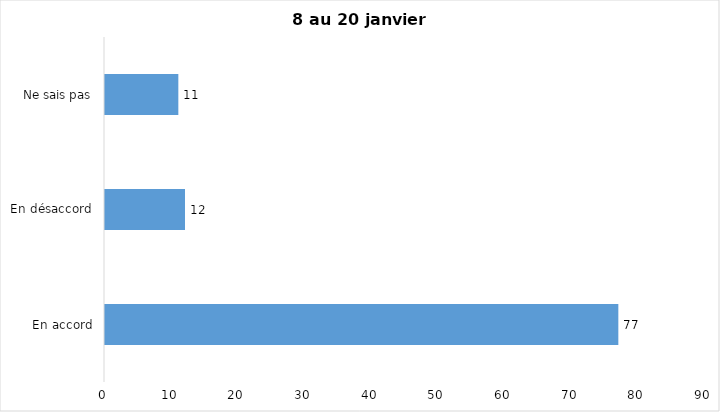
| Category | J’ai l’intention de recevoir le vaccin contre la COVID-19 lorsqu’il
sera disponible |
|---|---|
| En accord | 77 |
| En désaccord | 12 |
| Ne sais pas | 11 |